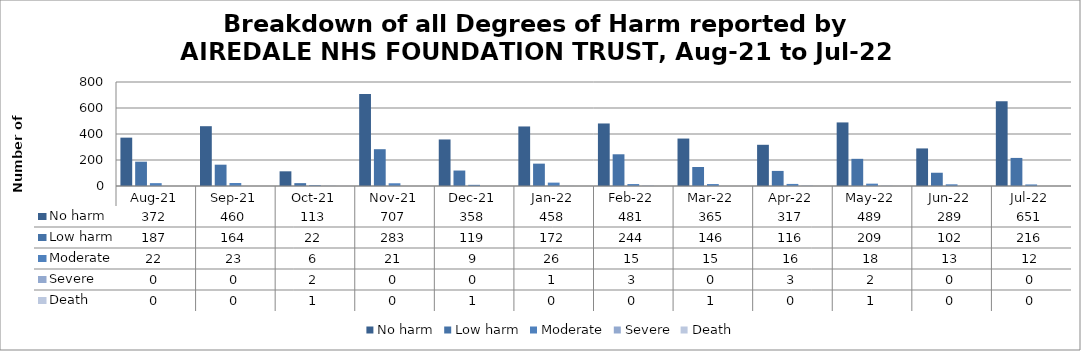
| Category | No harm | Low harm | Moderate | Severe | Death |
|---|---|---|---|---|---|
| Aug-21 | 372 | 187 | 22 | 0 | 0 |
| Sep-21 | 460 | 164 | 23 | 0 | 0 |
| Oct-21 | 113 | 22 | 6 | 2 | 1 |
| Nov-21 | 707 | 283 | 21 | 0 | 0 |
| Dec-21 | 358 | 119 | 9 | 0 | 1 |
| Jan-22 | 458 | 172 | 26 | 1 | 0 |
| Feb-22 | 481 | 244 | 15 | 3 | 0 |
| Mar-22 | 365 | 146 | 15 | 0 | 1 |
| Apr-22 | 317 | 116 | 16 | 3 | 0 |
| May-22 | 489 | 209 | 18 | 2 | 1 |
| Jun-22 | 289 | 102 | 13 | 0 | 0 |
| Jul-22 | 651 | 216 | 12 | 0 | 0 |